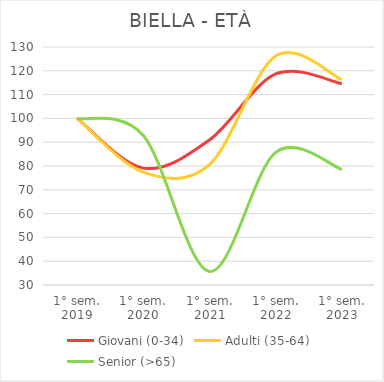
| Category | Giovani (0-34) | Adulti (35-64) | Senior (>65) |
|---|---|---|---|
| 1° sem.
2019 | 100 | 100 | 100 |
| 1° sem.
2020 | 79.113 | 77.428 | 92.857 |
| 1° sem.
2021 | 90.943 | 80.577 | 35.714 |
| 1° sem.
2022 | 118.669 | 126.247 | 85.714 |
| 1° sem.
2023 | 114.603 | 116.273 | 78.571 |